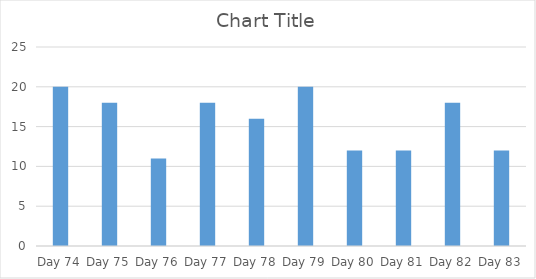
| Category | Series 0 |
|---|---|
| Day 74 | 20 |
| Day 75 | 18 |
| Day 76 | 11 |
| Day 77 | 18 |
| Day 78 | 16 |
| Day 79 | 20 |
| Day 80 | 12 |
| Day 81 | 12 |
| Day 82 | 18 |
| Day 83 | 12 |